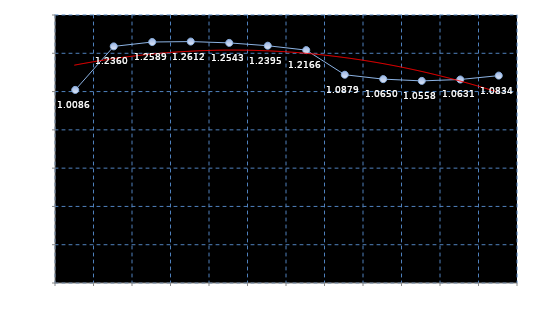
| Category | Series 0 |
|---|---|
| Mar 16 | 1.009 |
| Apr 16 | 1.236 |
| May 16 | 1.259 |
| Jun 16 | 1.261 |
| Jul 16 | 1.254 |
| Aug 16 | 1.239 |
| Sep 16 | 1.217 |
| Oct 16 | 1.088 |
| Nov 16 | 1.065 |
| Dec 16 | 1.056 |
| Jan 17 | 1.063 |
| Feb 17 | 1.083 |